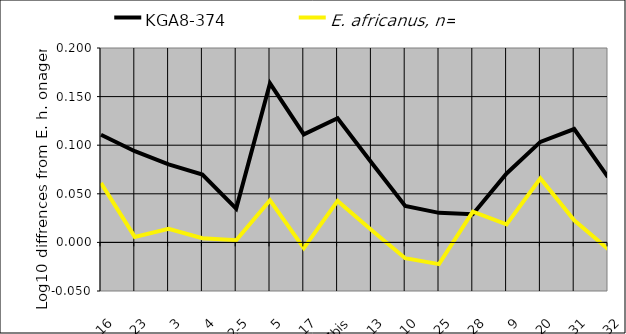
| Category | KGA8-374 | E. africanus, n=8-17 |
|---|---|---|
| 16 | 0.111 | 0.061 |
| 23 | 0.094 | 0.006 |
| 3 | 0.08 | 0.014 |
| 4 | 0.07 | 0.004 |
| 2-5 | 0.035 | 0.002 |
| 5 | 0.164 | 0.043 |
| 17 | 0.111 | -0.006 |
| 17bis | 0.128 | 0.043 |
| 13 | 0.082 | 0.013 |
| 10 | 0.038 | -0.016 |
| 25 | 0.03 | -0.022 |
| 28 | 0.029 | 0.032 |
| 9 | 0.071 | 0.019 |
| 20 | 0.103 | 0.066 |
| 31 | 0.117 | 0.023 |
| 32 | 0.067 | -0.007 |